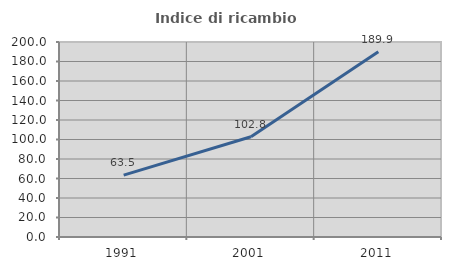
| Category | Indice di ricambio occupazionale  |
|---|---|
| 1991.0 | 63.504 |
| 2001.0 | 102.759 |
| 2011.0 | 189.933 |